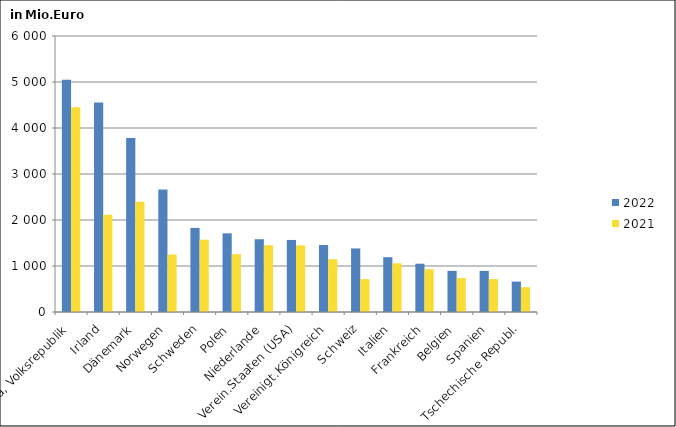
| Category | 2022 | 2021 |
|---|---|---|
| China, Volksrepublik | 5050.097 | 4451.409 |
| Irland | 4552.108 | 2112.543 |
| Dänemark | 3781.236 | 2398.215 |
| Norwegen | 2665.658 | 1250.848 |
| Schweden | 1827.714 | 1571.076 |
| Polen | 1709.998 | 1255.661 |
| Niederlande | 1581.399 | 1451.022 |
| Verein.Staaten (USA) | 1566.072 | 1449.456 |
| Vereinigt.Königreich | 1455.664 | 1147.691 |
| Schweiz | 1381.909 | 714.307 |
| Italien | 1191.102 | 1058.831 |
| Frankreich | 1049.706 | 930.531 |
| Belgien | 894.21 | 736.586 |
| Spanien | 893.546 | 715.742 |
| Tschechische Republ. | 660.687 | 539.326 |